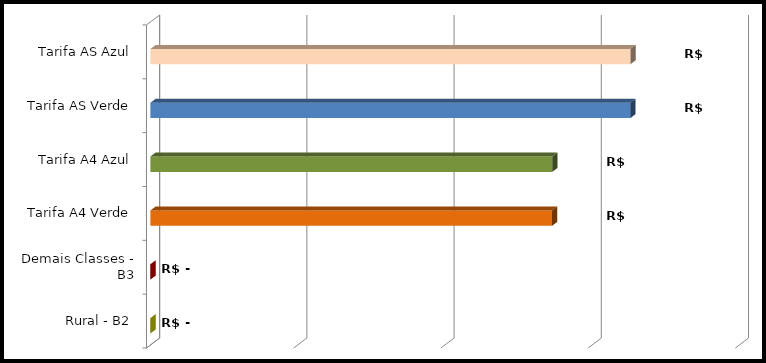
| Category | Series 0 | Series 1 |
|---|---|---|
| Rural - B2 | 0 |  |
| Demais Classes - B3 | 0 |  |
| Tarifa A4 Verde | 272887.786 |  |
| Tarifa A4 Azul | 272939.837 |  |
| Tarifa AS Verde | 326036.746 |  |
| Tarifa AS Azul | 326108.816 |  |